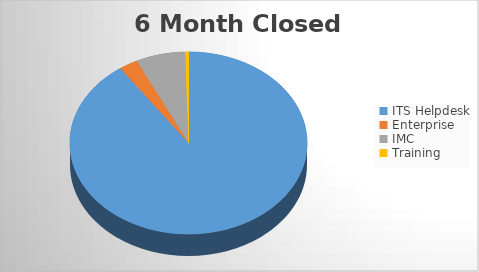
| Category | 6M Closed | 6M Opened |
|---|---|---|
| ITS Helpdesk | 2674 | 2580 |
| Enterprise | 76 | 39 |
| IMC | 199 | 180 |
| Training | 14 | 11 |